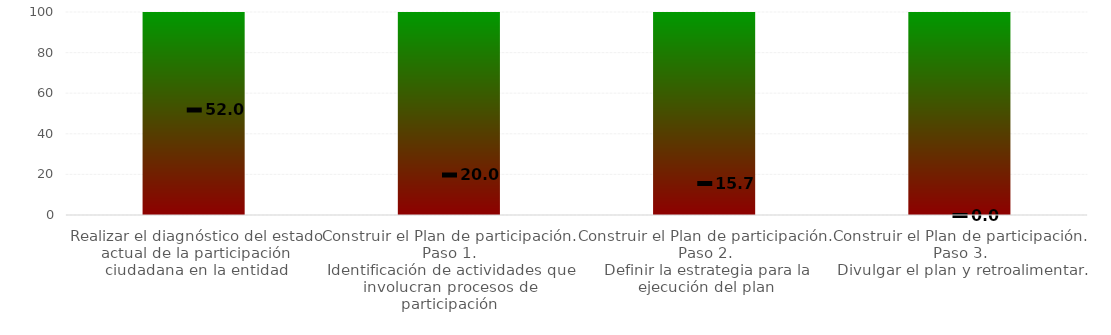
| Category | Niveles |
|---|---|
| Realizar el diagnóstico del estado actual de la participación ciudadana en la entidad | 100 |
| Construir el Plan de participación. 
 Paso 1. 
Identificación de actividades que involucran procesos de participación | 100 |
| Construir el Plan de participación. 
 Paso 2. 
Definir la estrategia para la ejecución del plan | 100 |
| Construir el Plan de participación. 
 Paso 3. 
Divulgar el plan y retroalimentar. | 100 |